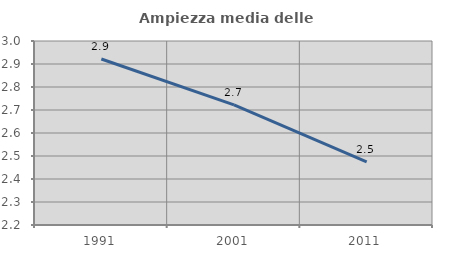
| Category | Ampiezza media delle famiglie |
|---|---|
| 1991.0 | 2.922 |
| 2001.0 | 2.722 |
| 2011.0 | 2.475 |